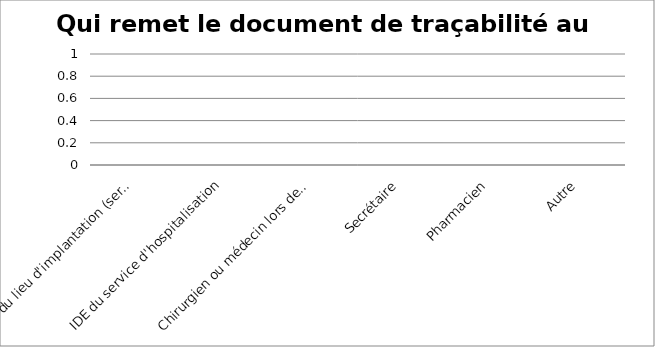
| Category | Qui remet le document de traçabilité au patient ? |
|---|---|
| IDE du lieu d'implantation (service, bloc opératoire…) | 0 |
| IDE du service d'hospitalisation | 0 |
| Chirurgien ou médecin lors de la visite contrôle | 0 |
| Secrétaire | 0 |
| Pharmacien | 0 |
| Autre | 0 |